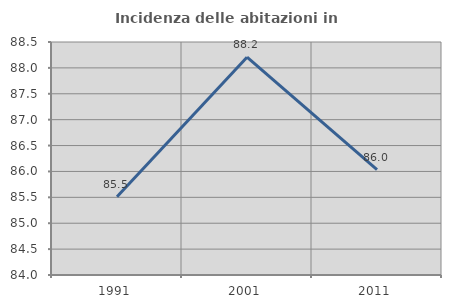
| Category | Incidenza delle abitazioni in proprietà  |
|---|---|
| 1991.0 | 85.513 |
| 2001.0 | 88.207 |
| 2011.0 | 86.036 |